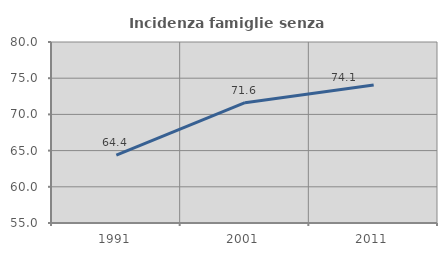
| Category | Incidenza famiglie senza nuclei |
|---|---|
| 1991.0 | 64.384 |
| 2001.0 | 71.622 |
| 2011.0 | 74.074 |